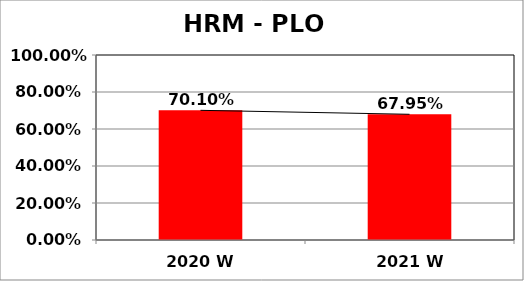
| Category | Series 0 |
|---|---|
| 2020 W | 0.701 |
| 2021 W | 0.68 |